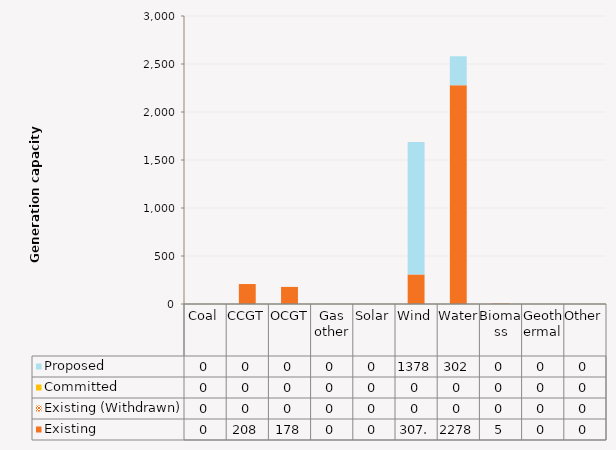
| Category | Existing | Existing (Withdrawn) | Committed | Proposed |
|---|---|---|---|---|
| Coal | 0 | 0 | 0 | 0 |
| CCGT | 208 | 0 | 0 | 0 |
| OCGT | 178 | 0 | 0 | 0 |
| Gas other | 0 | 0 | 0 | 0 |
| Solar | 0 | 0 | 0 | 0 |
| Wind | 307.75 | 0 | 0 | 1378.7 |
| Water | 2278.8 | 0 | 0 | 302 |
| Biomass | 5 | 0 | 0 | 0 |
| Geothermal | 0 | 0 | 0 | 0 |
| Other | 0 | 0 | 0 | 0 |